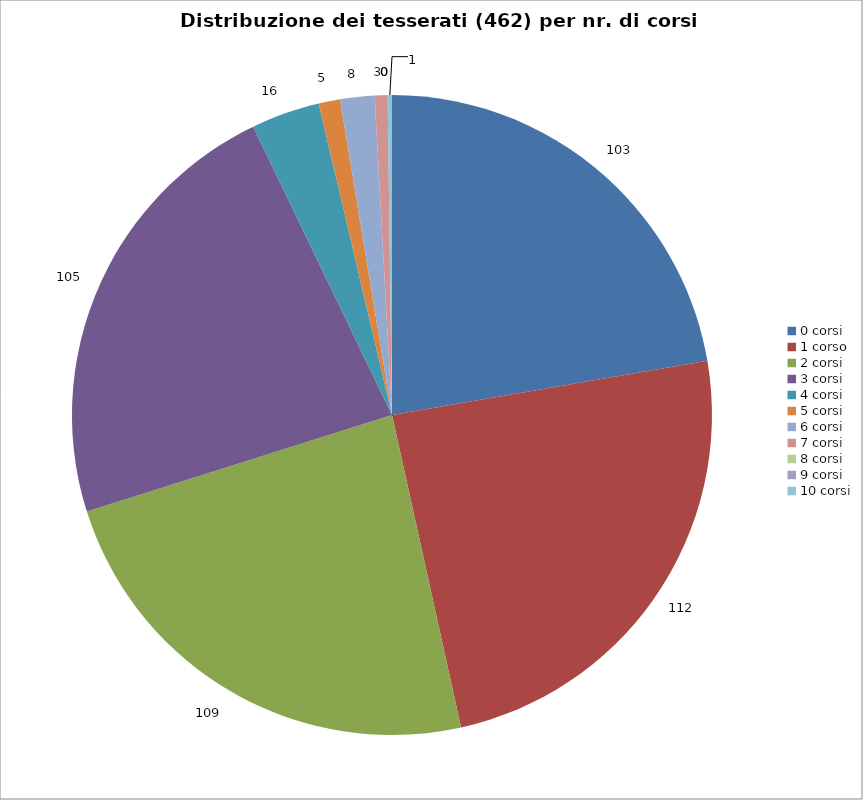
| Category | Nr. Tesserati |
|---|---|
| 0 corsi | 103 |
| 1 corso | 112 |
| 2 corsi | 109 |
| 3 corsi | 105 |
| 4 corsi | 16 |
| 5 corsi | 5 |
| 6 corsi | 8 |
| 7 corsi | 3 |
| 8 corsi | 0 |
| 9 corsi | 0 |
| 10 corsi | 1 |